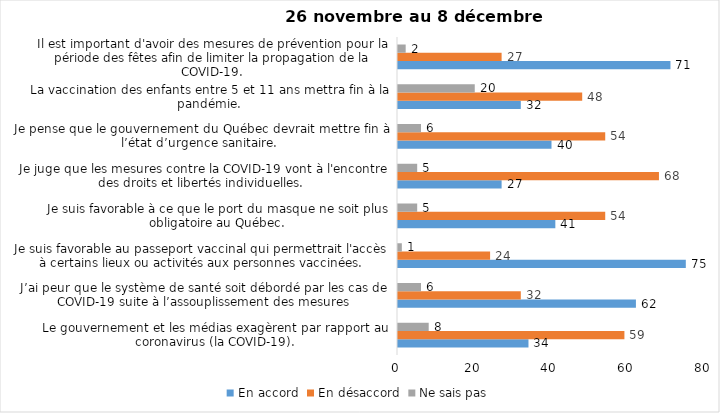
| Category | En accord | En désaccord | Ne sais pas |
|---|---|---|---|
| Le gouvernement et les médias exagèrent par rapport au coronavirus (la COVID-19). | 34 | 59 | 8 |
| J’ai peur que le système de santé soit débordé par les cas de COVID-19 suite à l’assouplissement des mesures | 62 | 32 | 6 |
| Je suis favorable au passeport vaccinal qui permettrait l'accès à certains lieux ou activités aux personnes vaccinées. | 75 | 24 | 1 |
| Je suis favorable à ce que le port du masque ne soit plus obligatoire au Québec. | 41 | 54 | 5 |
| Je juge que les mesures contre la COVID-19 vont à l'encontre des droits et libertés individuelles.  | 27 | 68 | 5 |
| Je pense que le gouvernement du Québec devrait mettre fin à l’état d’urgence sanitaire.  | 40 | 54 | 6 |
| La vaccination des enfants entre 5 et 11 ans mettra fin à la pandémie. | 32 | 48 | 20 |
| Il est important d'avoir des mesures de prévention pour la période des fêtes afin de limiter la propagation de la COVID-19. | 71 | 27 | 2 |